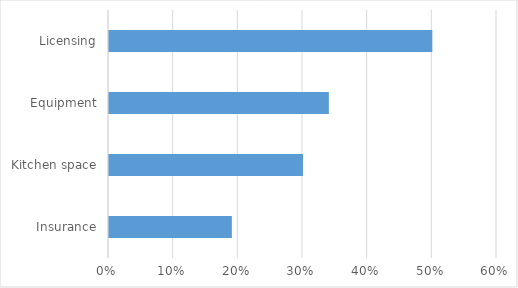
| Category | Series 0 |
|---|---|
| Insurance | 0.19 |
| Kitchen space | 0.3 |
| Equipment | 0.34 |
| Licensing | 0.5 |